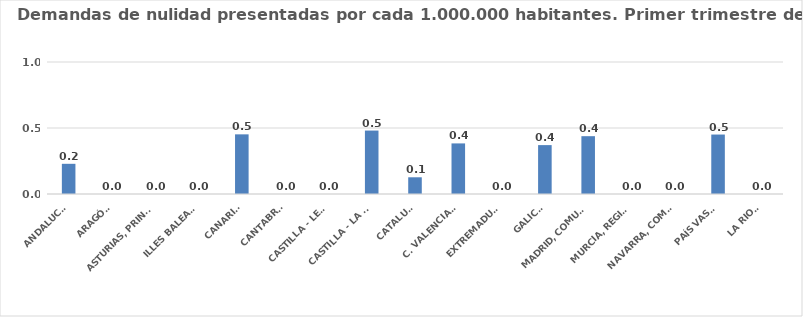
| Category | Series 0 |
|---|---|
| ANDALUCÍA | 0.229 |
| ARAGÓN | 0 |
| ASTURIAS, PRINCIPADO | 0 |
| ILLES BALEARS | 0 |
| CANARIAS | 0.452 |
| CANTABRIA | 0 |
| CASTILLA - LEÓN | 0 |
| CASTILLA - LA MANCHA | 0.481 |
| CATALUÑA | 0.127 |
| C. VALENCIANA | 0.383 |
| EXTREMADURA | 0 |
| GALICIA | 0.37 |
| MADRID, COMUNIDAD | 0.438 |
| MURCIA, REGIÓN | 0 |
| NAVARRA, COM. FORAL | 0 |
| PAÍS VASCO | 0.45 |
| LA RIOJA | 0 |